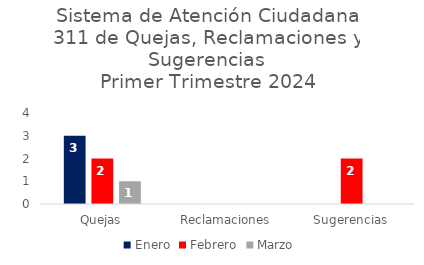
| Category | Enero | Febrero | Marzo |
|---|---|---|---|
| Quejas | 3 | 2 | 1 |
| Reclamaciones | 0 | 0 | 0 |
| Sugerencias | 0 | 2 | 0 |